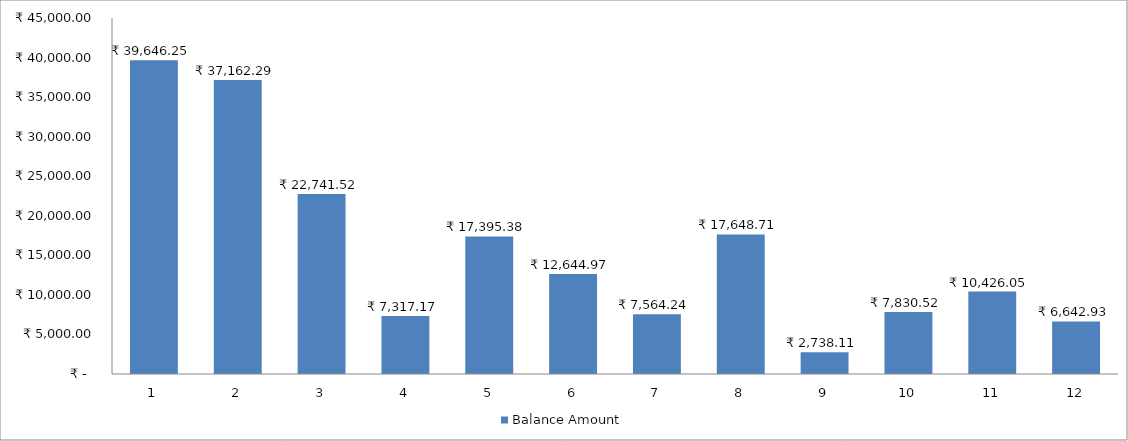
| Category | Balance Amount |
|---|---|
| 0 | 39646.25 |
| 1 | 37162.293 |
| 2 | 22741.52 |
| 3 | 7317.172 |
| 4 | 17395.376 |
| 5 | 12644.97 |
| 6 | 7564.238 |
| 7 | 17648.713 |
| 8 | 2738.108 |
| 9 | 7830.519 |
| 10 | 10426.049 |
| 11 | 6642.928 |